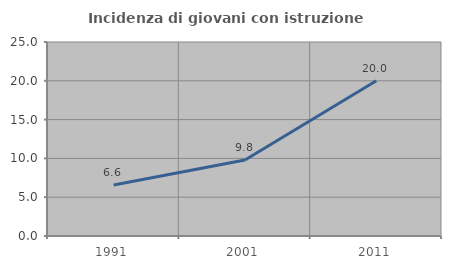
| Category | Incidenza di giovani con istruzione universitaria |
|---|---|
| 1991.0 | 6.569 |
| 2001.0 | 9.804 |
| 2011.0 | 20 |